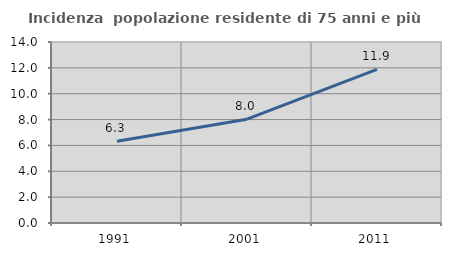
| Category | Incidenza  popolazione residente di 75 anni e più |
|---|---|
| 1991.0 | 6.327 |
| 2001.0 | 8.028 |
| 2011.0 | 11.877 |